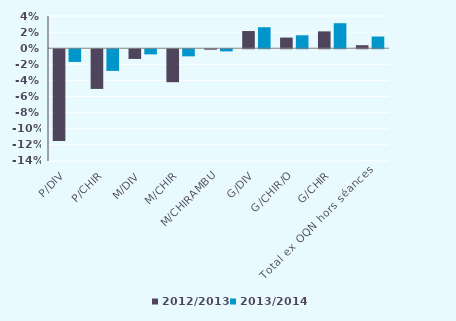
| Category | 2012/2013 | 2013/2014 |
|---|---|---|
| P/DIV | -0.114 | -0.016 |
| P/CHIR | -0.049 | -0.027 |
| M/DIV | -0.012 | -0.006 |
| M/CHIR | -0.041 | -0.009 |
| M/CHIRAMBU | -0.001 | -0.003 |
| G/DIV | 0.021 | 0.026 |
| G/CHIR/O | 0.013 | 0.016 |
| G/CHIR | 0.021 | 0.031 |
| Total ex OQN hors séances | 0.004 | 0.014 |